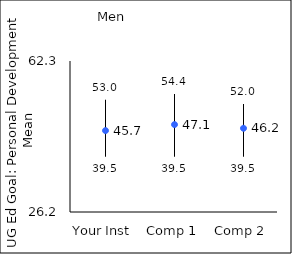
| Category | 25th percentile | 75th percentile | Mean |
|---|---|---|---|
| Your Inst | 39.5 | 53 | 45.66 |
| Comp 1 | 39.5 | 54.4 | 47.1 |
| Comp 2 | 39.5 | 52 | 46.22 |